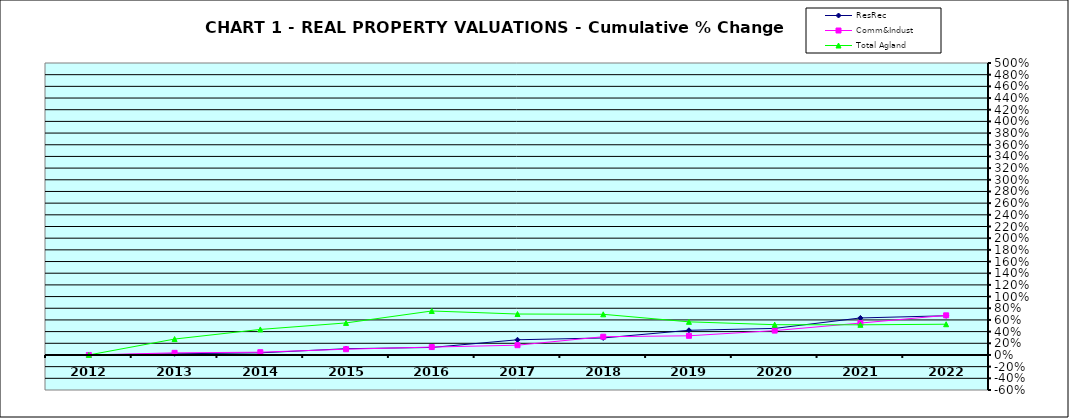
| Category | ResRec | Comm&Indust | Total Agland |
|---|---|---|---|
| 2012.0 | 0 | 0 | 0 |
| 2013.0 | 0.02 | 0.036 | 0.272 |
| 2014.0 | 0.037 | 0.047 | 0.437 |
| 2015.0 | 0.107 | 0.099 | 0.549 |
| 2016.0 | 0.129 | 0.135 | 0.753 |
| 2017.0 | 0.26 | 0.167 | 0.701 |
| 2018.0 | 0.291 | 0.313 | 0.696 |
| 2019.0 | 0.423 | 0.328 | 0.567 |
| 2020.0 | 0.455 | 0.417 | 0.518 |
| 2021.0 | 0.634 | 0.546 | 0.516 |
| 2022.0 | 0.671 | 0.679 | 0.526 |